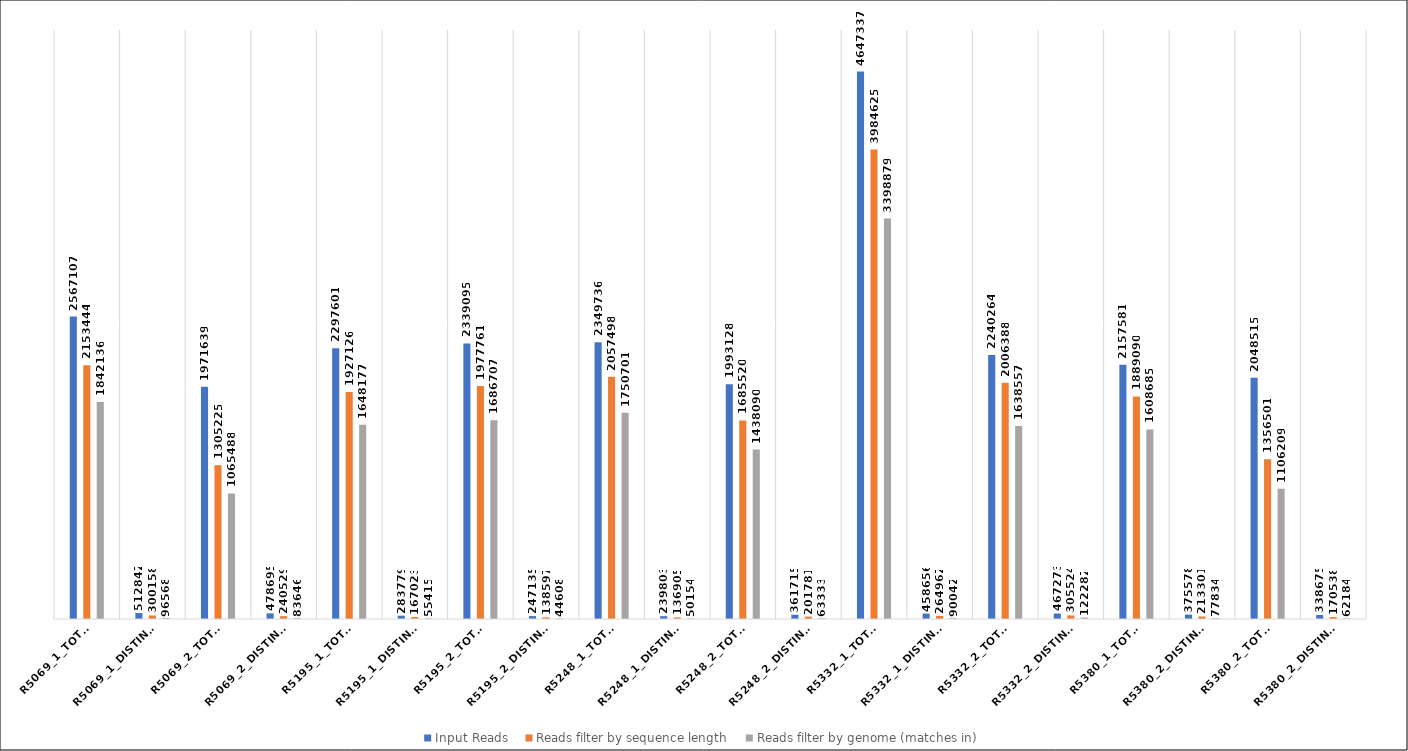
| Category | Input Reads | Reads filter by sequence length | Reads filter by genome (matches in) |
|---|---|---|---|
| R5069_1_total | 25671071 | 21534449 | 18421362 |
| R5069_1_distinct | 512842 | 300158 | 96568 |
| R5069_2_total | 19716395 | 13052257 | 10654881 |
| R5069_2_distinct | 478695 | 240529 | 83646 |
| R5195_1_total | 22976014 | 19271268 | 16481778 |
| R5195_1_distinct | 283779 | 167023 | 55415 |
| R5195_2_total | 23390956 | 19777614 | 16867076 |
| R5195_2_distinct | 247135 | 138597 | 44608 |
| R5248_1_total | 23497362 | 20574984 | 17507018 |
| R5248_1_distinct | 239803 | 136905 | 50154 |
| R5248_2_total | 19931281 | 16855202 | 14380905 |
| R5248_2_distinct | 361715 | 201781 | 63333 |
| R5332_1_total | 46473376 | 39846252 | 33988796 |
| R5332_1_distinct | 458656 | 264962 | 90042 |
| R5332_2_total | 22402647 | 20063887 | 16385579 |
| R5332_2_distinct | 467273 | 305524 | 122282 |
| R5380_1_total | 21575816 | 18890900 | 16086852 |
| R5380_2_distinct | 375578 | 213301 | 77834 |
| R5380_2_total | 20485152 | 13565014 | 11062090 |
| R5380_2_distinct | 338675 | 170538 | 62184 |